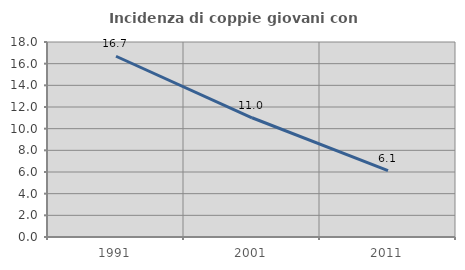
| Category | Incidenza di coppie giovani con figli |
|---|---|
| 1991.0 | 16.684 |
| 2001.0 | 11.006 |
| 2011.0 | 6.132 |